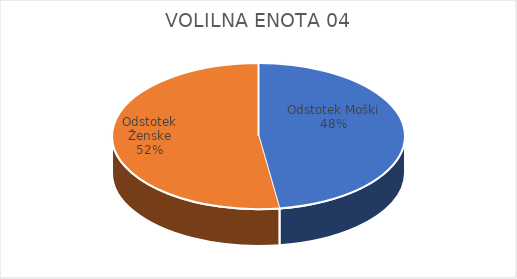
| Category | VOLILNA ENOTA 04 | #REF! | Slovenija skupaj |
|---|---|---|---|
| Odstotek Moški | 25.86 |  | 25.26 |
| Odstotek Ženske | 28.33 |  | 26.62 |